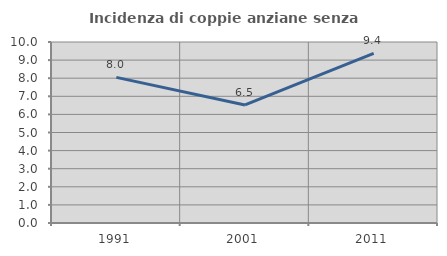
| Category | Incidenza di coppie anziane senza figli  |
|---|---|
| 1991.0 | 8.046 |
| 2001.0 | 6.522 |
| 2011.0 | 9.375 |